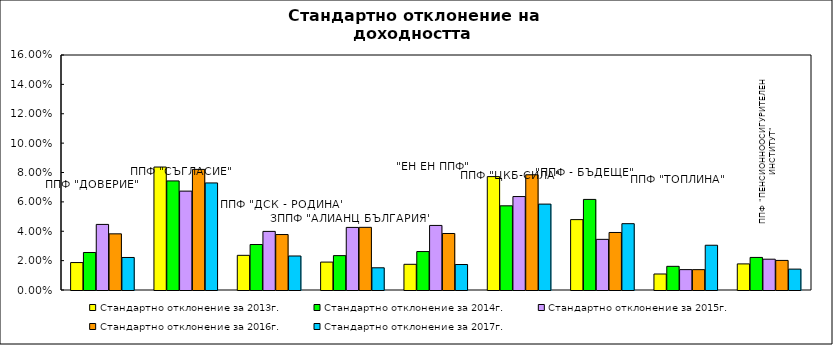
| Category | Стандартно отклонение за 2013г. | Стандартно отклонение за 2014г. | Стандартно отклонение за 2015г. | Стандартно отклонение за 2016г. | Стандартно отклонение за 2017г. |
|---|---|---|---|---|---|
| ППФ "ДОВЕРИЕ"  | 0.019 | 0.026 | 0.045 | 0.038 | 0.022 |
| ППФ "СЪГЛАСИЕ"  | 0.084 | 0.074 | 0.067 | 0.082 | 0.073 |
| ППФ "ДСК - РОДИНА" | 0.024 | 0.031 | 0.04 | 0.038 | 0.023 |
| ЗППФ "АЛИАНЦ БЪЛГАРИЯ" | 0.019 | 0.023 | 0.043 | 0.043 | 0.015 |
| "ЕН ЕН ППФ" | 0.017 | 0.026 | 0.044 | 0.038 | 0.017 |
| ППФ "ЦКБ-СИЛА" | 0.077 | 0.057 | 0.064 | 0.078 | 0.058 |
| "ППФ - БЪДЕЩЕ" | 0.048 | 0.062 | 0.034 | 0.039 | 0.045 |
| ППФ "ТОПЛИНА" | 0.011 | 0.016 | 0.014 | 0.014 | 0.03 |
| ППФ "ПЕНСИОННООСИГУРИТЕЛЕН ИНСТИТУТ" | 0.018 | 0.022 | 0.021 | 0.02 | 0.014 |